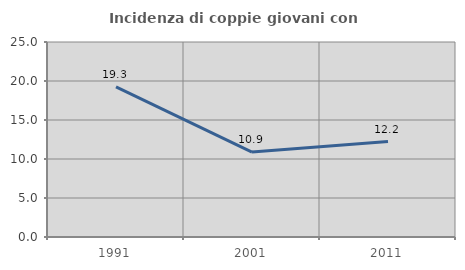
| Category | Incidenza di coppie giovani con figli |
|---|---|
| 1991.0 | 19.258 |
| 2001.0 | 10.893 |
| 2011.0 | 12.239 |